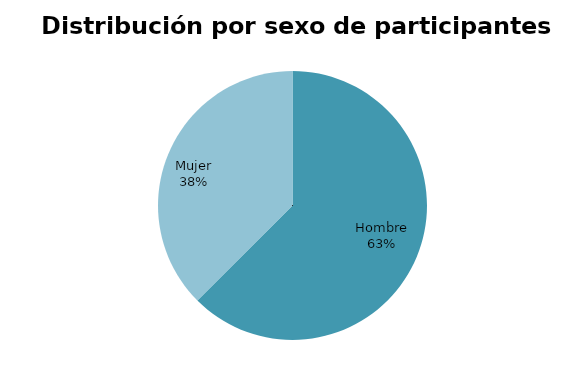
| Category | Series 0 |
|---|---|
| Hombre | 5 |
| Mujer | 3 |